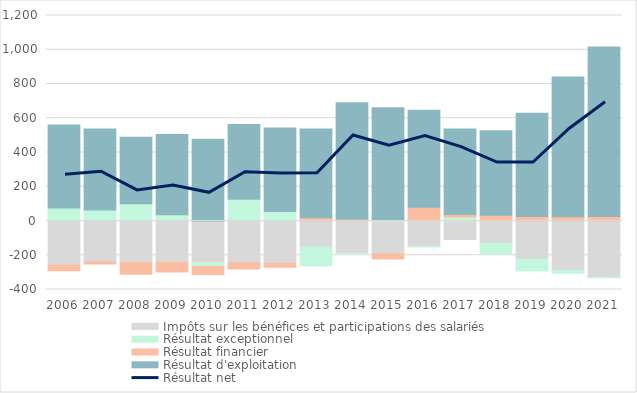
| Category | Impôts sur les bénéfices et participations des salariés | Résultat exceptionnel | Résultat financier | Résultat d'exploitation |
|---|---|---|---|---|
| 2006 | -257.2 | 76.1 | -33.1 | 484.4 |
| 2007 | -239.2 | 64.5 | -12.2 | 472.3 |
| 2008 | -242.2 | 101.1 | -68.8 | 388.5 |
| 2009 | -242.9 | 36.1 | -54.8 | 469.4 |
| 2010 | -242.4 | -22.8 | -47.3 | 477.6 |
| 2011 | -243.5 | 127.4 | -36.5 | 435.6 |
| 2012 | -247.7 | 55.3 | -22 | 488.4 |
| 2013 | -152.4 | -109.2 | 18.9 | 518.5 |
| 2014 | -190.4 | -1.9 | 10.8 | 679 |
| 2015 | -192.9 | 7.6 | -29.7 | 653.2 |
| 2016 | -149.4 | -2.2 | 79.7 | 567.1 |
| 2017 | -108.1 | 23.6 | 13.7 | 499.9 |
| 2018 | -130 | -59.7 | 33.9 | 493.2 |
| 2019 | -223.4 | -67.9 | 26.8 | 601.9 |
| 2020 | -287.3 | -18.4 | 24.6 | 815.6 |
| 2021 | -330.6 | -0.3 | 26.7 | 989.9 |